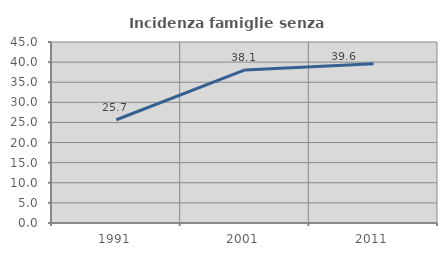
| Category | Incidenza famiglie senza nuclei |
|---|---|
| 1991.0 | 25.672 |
| 2001.0 | 38.058 |
| 2011.0 | 39.618 |